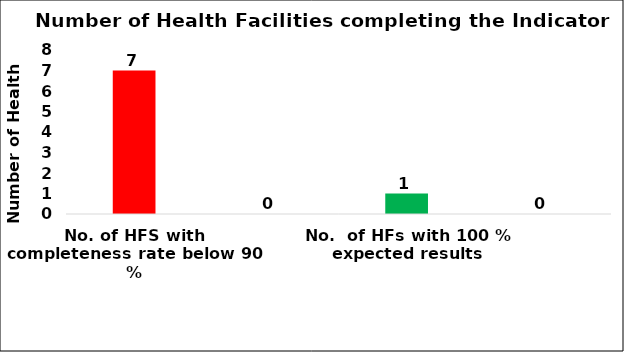
| Category | Number of OD |
|---|---|
| No. of HFS with completeness rate below 90 % | 7 |
| No. of HFs between 91-99 % | 0 |
| No.  of HFs with 100 % expected results | 1 |
| No. of HFs  with reporting completeness rate more than 100 % | 0 |